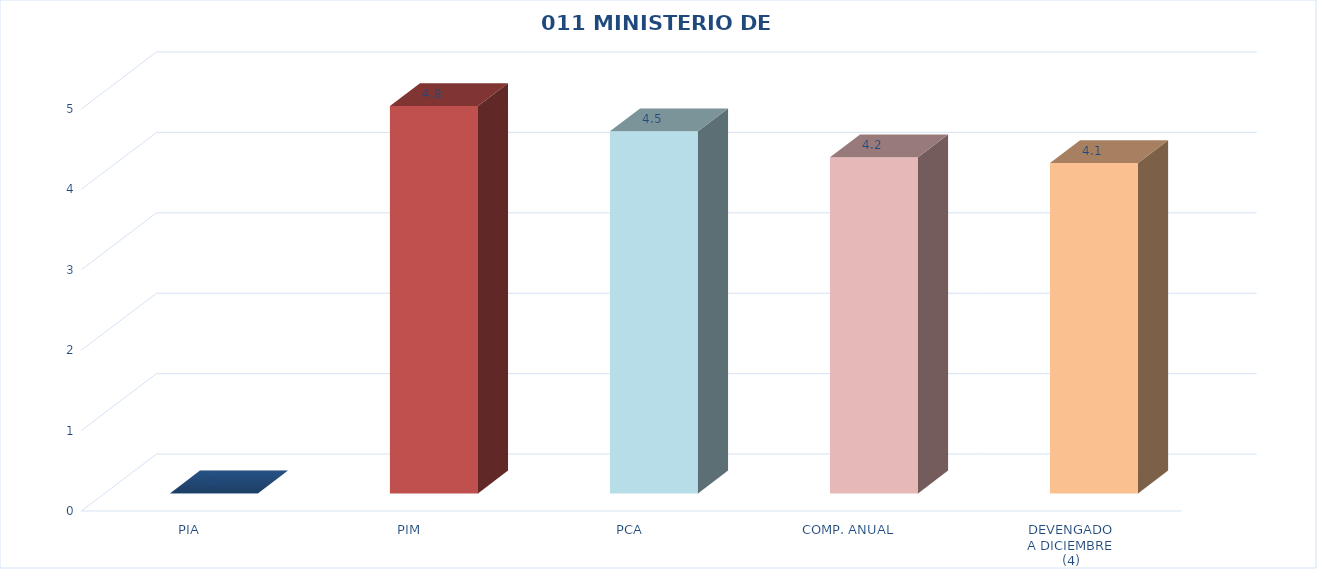
| Category | 011 MINISTERIO DE SALUD |
|---|---|
| PIA | 0 |
| PIM | 4.818 |
| PCA | 4.503 |
| COMP. ANUAL | 4.181 |
| DEVENGADO
A DICIEMBRE
(4) | 4.109 |